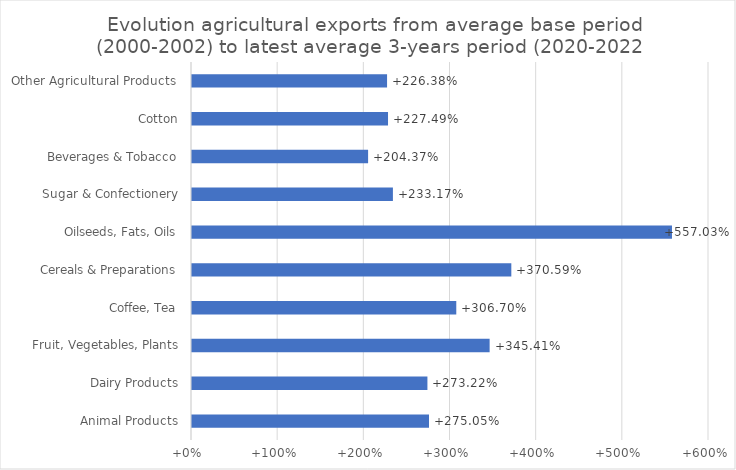
| Category |  % change of agricultural exports from 2000-02 to 2020-22 |
|---|---|
| Animal Products | 2.751 |
| Dairy Products | 2.732 |
| Fruit, Vegetables, Plants | 3.454 |
| Coffee, Tea | 3.067 |
| Cereals & Preparations | 3.706 |
| Oilseeds, Fats, Oils | 5.57 |
| Sugar & Confectionery | 2.332 |
| Beverages & Tobacco | 2.044 |
| Cotton | 2.275 |
| Other Agricultural Products  | 2.264 |